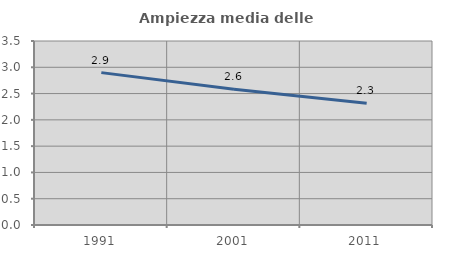
| Category | Ampiezza media delle famiglie |
|---|---|
| 1991.0 | 2.899 |
| 2001.0 | 2.583 |
| 2011.0 | 2.315 |